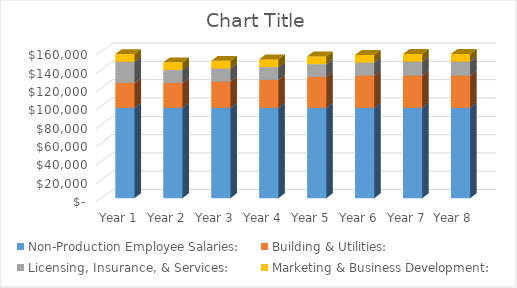
| Category | Non-Production Employee Salaries: | Building & Utilities:  | Licensing, Insurance, & Services:  | Marketing & Business Development:  |
|---|---|---|---|---|
| Year 1 | 98616.96 | 27300 | 23050 | 8400 |
| Year 2 | 98616.96 | 27300 | 14050 | 8400 |
| Year 3 | 98616.96 | 28920 | 14050 | 8400 |
| Year 4 | 98616.96 | 30540 | 14050 | 8400 |
| Year 5 | 98616.96 | 33780 | 14050 | 8400 |
| Year 6 | 98616.96 | 35400 | 14050 | 8400 |
| Year 7 | 98616.96 | 35400 | 15050 | 8400 |
| Year 8  | 98616.96 | 35400 | 15050 | 8400 |